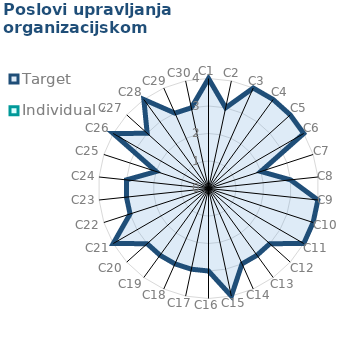
| Category | Target | Individual 4 |
|---|---|---|
| C1 | 4 | 0 |
| C2 | 3 | 0 |
| C3 | 4 | 0 |
| C4 | 4 | 0 |
| C5 | 4 | 0 |
| C6 | 4 | 0 |
| C7 | 2 | 0 |
| C8 | 3 | 0 |
| C9 | 4 | 0 |
| C10 | 4 | 0 |
| C11 | 4 | 0 |
| C12 | 3 | 0 |
| C13 | 3 | 0 |
| C14 | 3 | 0 |
| C15 | 4 | 0 |
| C16 | 3 | 0 |
| C17 | 3 | 0 |
| C18 | 3 | 0 |
| C19 | 3 | 0 |
| C20 | 3 | 0 |
| C21 | 4 | 0 |
| C22 | 3 | 0 |
| C23 | 3 | 0 |
| C24 | 3 | 0 |
| C25 | 2 | 0 |
| C26 | 4 | 0 |
| C27 | 3 | 0 |
| C28 | 4 | 0 |
| C29 | 3 | 0 |
| C30 | 3 | 0 |